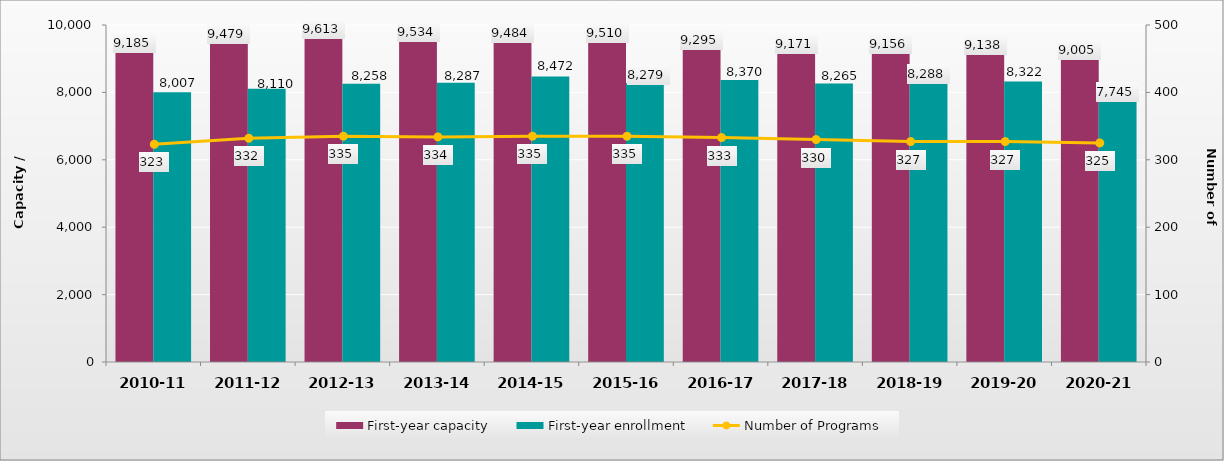
| Category | First-year capacity | First-year enrollment |
|---|---|---|
| 2010-11 | 9185 | 8007 |
| 2011-12 | 9479 | 8110 |
| 2012-13 | 9613 | 8258 |
| 2013-14 | 9534 | 8287 |
| 2014-15 | 9484 | 8472 |
| 2015-16 | 9510 | 8279 |
| 2016-17 | 9295 | 8370 |
| 2017-18 | 9171 | 8265 |
| 2018-19 | 9156 | 8288 |
| 2019-20 | 9138 | 8322 |
| 2020-21 | 9005 | 7745 |